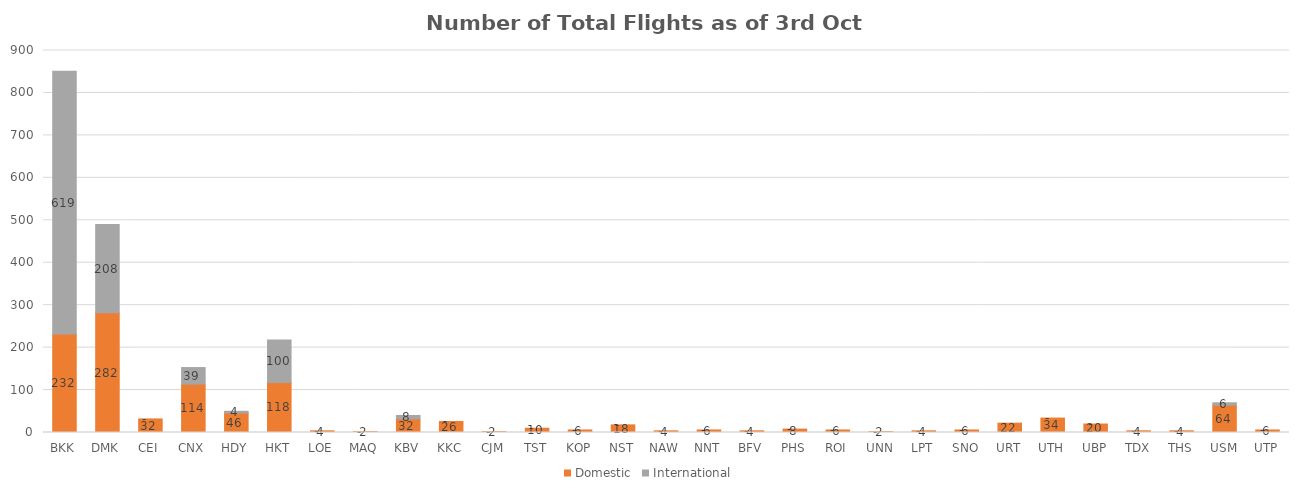
| Category | Domestic | International |
|---|---|---|
| BKK | 232 | 619 |
| DMK | 282 | 208 |
| CEI | 32 | 0 |
| CNX | 114 | 39 |
| HDY | 46 | 4 |
| HKT | 118 | 100 |
| LOE | 4 | 0 |
| MAQ | 2 | 0 |
| KBV | 32 | 8 |
| KKC | 26 | 0 |
| CJM | 2 | 0 |
| TST | 10 | 0 |
| KOP | 6 | 0 |
| NST | 18 | 0 |
| NAW | 4 | 0 |
| NNT | 6 | 0 |
| BFV | 4 | 0 |
| PHS | 8 | 0 |
| ROI | 6 | 0 |
| UNN | 2 | 0 |
| LPT | 4 | 0 |
| SNO | 6 | 0 |
| URT | 22 | 0 |
| UTH | 34 | 0 |
| UBP | 20 | 0 |
| TDX | 4 | 0 |
| THS | 4 | 0 |
| USM | 64 | 6 |
| UTP | 6 | 0 |